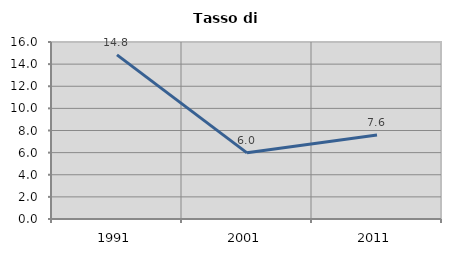
| Category | Tasso di disoccupazione   |
|---|---|
| 1991.0 | 14.837 |
| 2001.0 | 5.98 |
| 2011.0 | 7.599 |